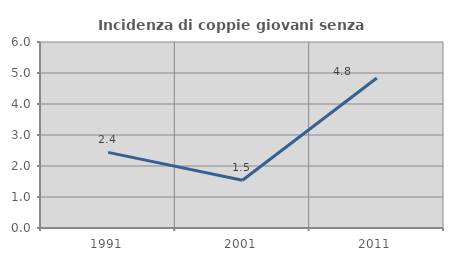
| Category | Incidenza di coppie giovani senza figli |
|---|---|
| 1991.0 | 2.439 |
| 2001.0 | 1.538 |
| 2011.0 | 4.839 |